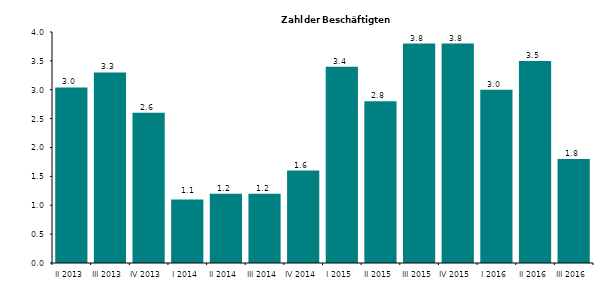
| Category | 3,0 3,3 2,6 1,1 1,2 1,2 1,6 3,4 2,8 3,8 3,8 3,0 3,5 1,8 |
|---|---|
| II 2013 | 3.039 |
| III 2013 | 3.3 |
| IV 2013 | 2.6 |
| I 2014 | 1.1 |
| II 2014 | 1.2 |
| III 2014 | 1.2 |
| IV 2014 | 1.6 |
| I 2015 | 3.4 |
| II 2015 | 2.8 |
| III 2015 | 3.8 |
| IV 2015 | 3.8 |
| I 2016 | 3 |
| II 2016 | 3.5 |
| III 2016 | 1.8 |